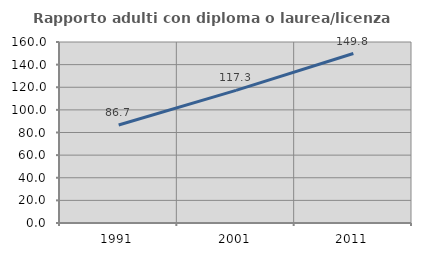
| Category | Rapporto adulti con diploma o laurea/licenza media  |
|---|---|
| 1991.0 | 86.674 |
| 2001.0 | 117.283 |
| 2011.0 | 149.825 |